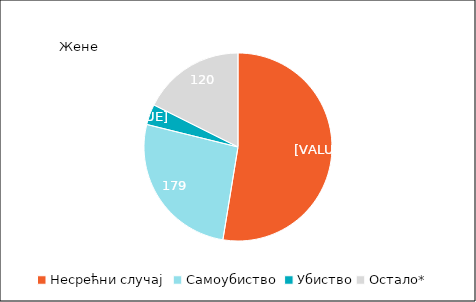
| Category | Жене |
|---|---|
| Несрећни случај  | 358 |
| Самоубиство  | 179 |
| Убиство | 24 |
| Остало* | 120 |